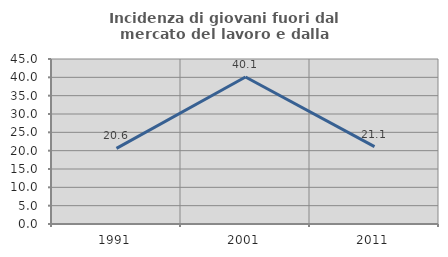
| Category | Incidenza di giovani fuori dal mercato del lavoro e dalla formazione  |
|---|---|
| 1991.0 | 20.613 |
| 2001.0 | 40.079 |
| 2011.0 | 21.121 |